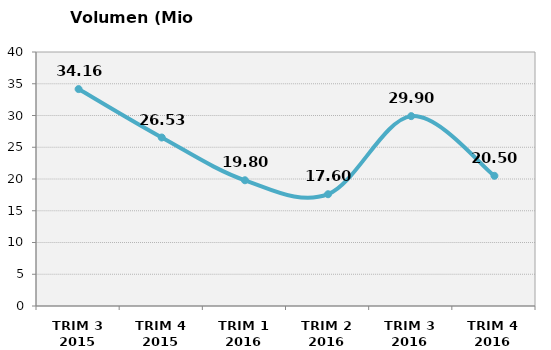
| Category | Volumen (Mio consumiciones) |
|---|---|
| TRIM 3 2015 | 34.16 |
| TRIM 4 2015 | 26.532 |
| TRIM 1 2016 | 19.8 |
| TRIM 2 2016 | 17.6 |
| TRIM 3 2016 | 29.9 |
| TRIM 4 2016 | 20.5 |